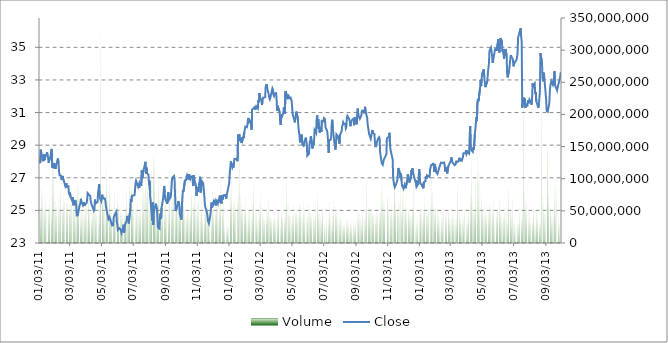
| Category | Volume |
|---|---|
| 2011-01-03 | 53450110 |
| 2011-01-04 | 54409555 |
| 2011-01-05 | 58998239 |
| 2011-01-06 | 88026271 |
| 2011-01-07 | 73761979 |
| 2011-01-10 | 57573450 |
| 2011-01-11 | 50308414 |
| 2011-01-12 | 52636699 |
| 2011-01-13 | 67082768 |
| 2011-01-14 | 62691185 |
| 2011-01-18 | 53332616 |
| 2011-01-19 | 50005830 |
| 2011-01-20 | 58621931 |
| 2011-01-21 | 58080269 |
| 2011-01-24 | 52055812 |
| 2011-01-25 | 42436532 |
| 2011-01-26 | 74628760 |
| 2011-01-27 | 146938589 |
| 2011-01-28 | 141259158 |
| 2011-01-31 | 65028938 |
| 2011-02-01 | 62810661 |
| 2011-02-02 | 45836488 |
| 2011-02-03 | 60340059 |
| 2011-02-04 | 40416627 |
| 2011-02-07 | 68980871 |
| 2011-02-08 | 34910467 |
| 2011-02-09 | 52905018 |
| 2011-02-10 | 76672349 |
| 2011-02-11 | 83939643 |
| 2011-02-14 | 56766112 |
| 2011-02-15 | 44120592 |
| 2011-02-16 | 70817867 |
| 2011-02-17 | 57211558 |
| 2011-02-18 | 68672855 |
| 2011-02-22 | 60888998 |
| 2011-02-23 | 60234083 |
| 2011-02-24 | 64499005 |
| 2011-02-25 | 53006263 |
| 2011-02-28 | 51379675 |
| 2011-03-01 | 60054986 |
| 2011-03-02 | 48658193 |
| 2011-03-03 | 68271500 |
| 2011-03-04 | 70437154 |
| 2011-03-07 | 64987131 |
| 2011-03-08 | 50555383 |
| 2011-03-09 | 39792379 |
| 2011-03-10 | 66557502 |
| 2011-03-11 | 49906849 |
| 2011-03-14 | 54456558 |
| 2011-03-15 | 76064201 |
| 2011-03-16 | 100718988 |
| 2011-03-17 | 62506557 |
| 2011-03-18 | 85486688 |
| 2011-03-21 | 46895059 |
| 2011-03-22 | 30903641 |
| 2011-03-23 | 44018832 |
| 2011-03-24 | 38696661 |
| 2011-03-25 | 57031023 |
| 2011-03-28 | 48975380 |
| 2011-03-29 | 40772423 |
| 2011-03-30 | 42000178 |
| 2011-03-31 | 63281785 |
| 2011-04-01 | 63114201 |
| 2011-04-04 | 35441052 |
| 2011-04-05 | 73693937 |
| 2011-04-06 | 65589617 |
| 2011-04-07 | 46134637 |
| 2011-04-08 | 39890629 |
| 2011-04-11 | 34286211 |
| 2011-04-12 | 36936975 |
| 2011-04-13 | 38144621 |
| 2011-04-14 | 55245529 |
| 2011-04-15 | 65080348 |
| 2011-04-18 | 58046281 |
| 2011-04-19 | 38892333 |
| 2011-04-20 | 61608587 |
| 2011-04-21 | 46892292 |
| 2011-04-25 | 33525057 |
| 2011-04-26 | 69199457 |
| 2011-04-27 | 52688981 |
| 2011-04-28 | 80158577 |
| 2011-04-29 | 319317852 |
| 2011-05-02 | 89834099 |
| 2011-05-03 | 71909361 |
| 2011-05-04 | 73292270 |
| 2011-05-05 | 55626793 |
| 2011-05-06 | 55993642 |
| 2011-05-09 | 38696376 |
| 2011-05-10 | 120806139 |
| 2011-05-11 | 78604669 |
| 2011-05-12 | 77366952 |
| 2011-05-13 | 66819290 |
| 2011-05-16 | 91402408 |
| 2011-05-17 | 82894458 |
| 2011-05-18 | 53931025 |
| 2011-05-19 | 37783590 |
| 2011-05-20 | 45451462 |
| 2011-05-23 | 52703425 |
| 2011-05-24 | 47692976 |
| 2011-05-25 | 34903112 |
| 2011-05-26 | 78016538 |
| 2011-05-27 | 50254323 |
| 2011-05-31 | 60196203 |
| 2011-06-01 | 74036467 |
| 2011-06-02 | 51487738 |
| 2011-06-03 | 60697662 |
| 2011-06-06 | 54778670 |
| 2011-06-07 | 41112524 |
| 2011-06-08 | 42206806 |
| 2011-06-09 | 42882262 |
| 2011-06-10 | 49327104 |
| 2011-06-13 | 47574074 |
| 2011-06-14 | 42902699 |
| 2011-06-15 | 49410128 |
| 2011-06-16 | 57190388 |
| 2011-06-17 | 83352877 |
| 2011-06-20 | 54344045 |
| 2011-06-21 | 49712104 |
| 2011-06-22 | 44290814 |
| 2011-06-23 | 59472060 |
| 2011-06-24 | 101387157 |
| 2011-06-27 | 92044114 |
| 2011-06-28 | 81032018 |
| 2011-06-29 | 66052078 |
| 2011-06-30 | 52536288 |
| 2011-07-01 | 52914516 |
| 2011-07-05 | 37803059 |
| 2011-07-06 | 48748894 |
| 2011-07-07 | 51950943 |
| 2011-07-08 | 58332434 |
| 2011-07-11 | 44000715 |
| 2011-07-12 | 47320989 |
| 2011-07-13 | 40869336 |
| 2011-07-14 | 46385928 |
| 2011-07-15 | 49134401 |
| 2011-07-18 | 44506711 |
| 2011-07-19 | 86730600 |
| 2011-07-20 | 49795352 |
| 2011-07-21 | 81737342 |
| 2011-07-22 | 76380505 |
| 2011-07-25 | 108486590 |
| 2011-07-26 | 74643391 |
| 2011-07-27 | 71492139 |
| 2011-07-28 | 83766901 |
| 2011-07-29 | 104394739 |
| 2011-08-01 | 61846218 |
| 2011-08-02 | 87164516 |
| 2011-08-03 | 64583238 |
| 2011-08-04 | 92953765 |
| 2011-08-05 | 112072491 |
| 2011-08-08 | 134257113 |
| 2011-08-09 | 126278864 |
| 2011-08-10 | 127819718 |
| 2011-08-11 | 90697205 |
| 2011-08-12 | 64791784 |
| 2011-08-15 | 56529388 |
| 2011-08-16 | 54256723 |
| 2011-08-17 | 50923682 |
| 2011-08-18 | 105715509 |
| 2011-08-19 | 77402319 |
| 2011-08-22 | 54720967 |
| 2011-08-23 | 59671022 |
| 2011-08-24 | 45329610 |
| 2011-08-25 | 48191924 |
| 2011-08-26 | 71959200 |
| 2011-08-29 | 38863136 |
| 2011-08-30 | 57341367 |
| 2011-08-31 | 59301724 |
| 2011-09-01 | 60511548 |
| 2011-09-02 | 43897065 |
| 2011-09-06 | 54931986 |
| 2011-09-07 | 41960917 |
| 2011-09-08 | 65818212 |
| 2011-09-09 | 64531339 |
| 2011-09-12 | 55047244 |
| 2011-09-13 | 48794446 |
| 2011-09-14 | 66742534 |
| 2011-09-15 | 67809210 |
| 2011-09-16 | 89685212 |
| 2011-09-19 | 52324841 |
| 2011-09-20 | 49211857 |
| 2011-09-21 | 72750701 |
| 2011-09-22 | 96285920 |
| 2011-09-23 | 64769019 |
| 2011-09-26 | 51057571 |
| 2011-09-27 | 55623705 |
| 2011-09-28 | 60740399 |
| 2011-09-29 | 63411976 |
| 2011-09-30 | 54086654 |
| 2011-10-03 | 64596171 |
| 2011-10-04 | 83485396 |
| 2011-10-05 | 94061244 |
| 2011-10-06 | 55113496 |
| 2011-10-07 | 52748451 |
| 2011-10-10 | 41822239 |
| 2011-10-11 | 38826791 |
| 2011-10-12 | 52493454 |
| 2011-10-13 | 43830076 |
| 2011-10-14 | 50949439 |
| 2011-10-17 | 39453241 |
| 2011-10-18 | 52491969 |
| 2011-10-19 | 42881648 |
| 2011-10-20 | 76300104 |
| 2011-10-21 | 76620533 |
| 2011-10-24 | 56897791 |
| 2011-10-25 | 53554554 |
| 2011-10-26 | 63029830 |
| 2011-10-27 | 74515622 |
| 2011-10-28 | 57712077 |
| 2011-10-31 | 46798951 |
| 2011-11-01 | 61186956 |
| 2011-11-02 | 53536398 |
| 2011-11-03 | 65837011 |
| 2011-11-04 | 36553269 |
| 2011-11-07 | 42586043 |
| 2011-11-08 | 47825636 |
| 2011-11-09 | 62950825 |
| 2011-11-10 | 32517281 |
| 2011-11-11 | 37903971 |
| 2011-11-14 | 34199146 |
| 2011-11-15 | 43877075 |
| 2011-11-16 | 53262743 |
| 2011-11-17 | 70977495 |
| 2011-11-18 | 47627157 |
| 2011-11-21 | 61882819 |
| 2011-11-22 | 49204488 |
| 2011-11-23 | 49105287 |
| 2011-11-25 | 26164410 |
| 2011-11-28 | 46771878 |
| 2011-11-29 | 40920907 |
| 2011-11-30 | 81353522 |
| 2011-12-01 | 48545338 |
| 2011-12-02 | 52295245 |
| 2011-12-05 | 56818367 |
| 2011-12-06 | 46175294 |
| 2011-12-07 | 62669835 |
| 2011-12-08 | 60522185 |
| 2011-12-09 | 53790403 |
| 2011-12-12 | 38945867 |
| 2011-12-13 | 54581003 |
| 2011-12-14 | 47927107 |
| 2011-12-15 | 46217486 |
| 2011-12-16 | 101410082 |
| 2011-12-19 | 52258284 |
| 2011-12-20 | 60767523 |
| 2011-12-21 | 64134140 |
| 2011-12-22 | 35794085 |
| 2011-12-23 | 23205776 |
| 2011-12-27 | 21287332 |
| 2011-12-28 | 29823501 |
| 2011-12-29 | 22616883 |
| 2011-12-30 | 27396333 |
| 2012-01-03 | 64735391 |
| 2012-01-04 | 80519402 |
| 2012-01-05 | 56082205 |
| 2012-01-06 | 99459469 |
| 2012-01-09 | 59708266 |
| 2012-01-10 | 60014333 |
| 2012-01-11 | 65586477 |
| 2012-01-12 | 49375477 |
| 2012-01-13 | 60204902 |
| 2012-01-17 | 72395252 |
| 2012-01-18 | 64860509 |
| 2012-01-19 | 74053427 |
| 2012-01-20 | 165902897 |
| 2012-01-23 | 76081814 |
| 2012-01-24 | 51711367 |
| 2012-01-25 | 59236267 |
| 2012-01-26 | 49107458 |
| 2012-01-27 | 44190573 |
| 2012-01-30 | 51114661 |
| 2012-01-31 | 50572372 |
| 2012-02-01 | 67413817 |
| 2012-02-02 | 52226255 |
| 2012-02-03 | 41845397 |
| 2012-02-06 | 28040378 |
| 2012-02-07 | 39242529 |
| 2012-02-08 | 49662740 |
| 2012-02-09 | 50481549 |
| 2012-02-10 | 44606751 |
| 2012-02-13 | 33322516 |
| 2012-02-14 | 59662711 |
| 2012-02-15 | 43316117 |
| 2012-02-16 | 94705078 |
| 2012-02-17 | 70040830 |
| 2012-02-21 | 50832547 |
| 2012-02-22 | 49253117 |
| 2012-02-23 | 35035609 |
| 2012-02-24 | 35577833 |
| 2012-02-27 | 34575391 |
| 2012-02-28 | 45230573 |
| 2012-02-29 | 59326545 |
| 2012-03-01 | 77348930 |
| 2012-03-02 | 47318927 |
| 2012-03-05 | 45239832 |
| 2012-03-06 | 51938950 |
| 2012-03-07 | 34340619 |
| 2012-03-08 | 36752011 |
| 2012-03-09 | 34628398 |
| 2012-03-12 | 34076755 |
| 2012-03-13 | 48951650 |
| 2012-03-14 | 41987743 |
| 2012-03-15 | 49070794 |
| 2012-03-16 | 65626398 |
| 2012-03-19 | 44797109 |
| 2012-03-20 | 41566788 |
| 2012-03-21 | 37935484 |
| 2012-03-22 | 31749516 |
| 2012-03-23 | 35912885 |
| 2012-03-26 | 36758279 |
| 2012-03-27 | 36274889 |
| 2012-03-28 | 41350041 |
| 2012-03-29 | 37038894 |
| 2012-03-30 | 31754740 |
| 2012-04-02 | 35850785 |
| 2012-04-03 | 42752025 |
| 2012-04-04 | 49455870 |
| 2012-04-05 | 50342719 |
| 2012-04-09 | 31062811 |
| 2012-04-10 | 54137247 |
| 2012-04-11 | 43016353 |
| 2012-04-12 | 38306010 |
| 2012-04-13 | 39749525 |
| 2012-04-16 | 38130098 |
| 2012-04-17 | 34361728 |
| 2012-04-18 | 40555467 |
| 2012-04-19 | 54781106 |
| 2012-04-20 | 106052027 |
| 2012-04-23 | 61403840 |
| 2012-04-24 | 40871061 |
| 2012-04-25 | 62496907 |
| 2012-04-26 | 40312879 |
| 2012-04-27 | 41423609 |
| 2012-04-30 | 35706696 |
| 2012-05-01 | 43833208 |
| 2012-05-02 | 37387978 |
| 2012-05-03 | 31504327 |
| 2012-05-04 | 57928336 |
| 2012-05-07 | 48644875 |
| 2012-05-08 | 46337430 |
| 2012-05-09 | 50309301 |
| 2012-05-10 | 43839116 |
| 2012-05-11 | 43460342 |
| 2012-05-14 | 40528885 |
| 2012-05-15 | 61830348 |
| 2012-05-16 | 60083687 |
| 2012-05-17 | 48487178 |
| 2012-05-18 | 56205262 |
| 2012-05-21 | 38794203 |
| 2012-05-22 | 39508257 |
| 2012-05-23 | 65170962 |
| 2012-05-24 | 52576022 |
| 2012-05-25 | 29508245 |
| 2012-05-29 | 37758958 |
| 2012-05-30 | 41590049 |
| 2012-05-31 | 39142318 |
| 2012-06-01 | 56641282 |
| 2012-06-04 | 47928161 |
| 2012-06-05 | 45715327 |
| 2012-06-06 | 46860486 |
| 2012-06-07 | 37794901 |
| 2012-06-08 | 42554321 |
| 2012-06-11 | 46365066 |
| 2012-06-12 | 35338135 |
| 2012-06-13 | 32984515 |
| 2012-06-14 | 39460156 |
| 2012-06-15 | 62314362 |
| 2012-06-18 | 58679618 |
| 2012-06-19 | 75725717 |
| 2012-06-20 | 36257101 |
| 2012-06-21 | 48461283 |
| 2012-06-22 | 45098017 |
| 2012-06-25 | 42225199 |
| 2012-06-26 | 38422237 |
| 2012-06-27 | 33783977 |
| 2012-06-28 | 45333920 |
| 2012-06-29 | 55227108 |
| 2012-07-02 | 30589039 |
| 2012-07-03 | 20941442 |
| 2012-07-05 | 28802821 |
| 2012-07-06 | 38297403 |
| 2012-07-09 | 30682552 |
| 2012-07-10 | 37537369 |
| 2012-07-11 | 39188842 |
| 2012-07-12 | 63530444 |
| 2012-07-13 | 39090585 |
| 2012-07-16 | 27901963 |
| 2012-07-17 | 33776331 |
| 2012-07-18 | 41100151 |
| 2012-07-19 | 46663183 |
| 2012-07-20 | 64027078 |
| 2012-07-23 | 55151880 |
| 2012-07-24 | 47723277 |
| 2012-07-25 | 45583794 |
| 2012-07-26 | 45302964 |
| 2012-07-27 | 44244766 |
| 2012-07-30 | 28904869 |
| 2012-07-31 | 37622808 |
| 2012-08-01 | 31722523 |
| 2012-08-02 | 39523066 |
| 2012-08-03 | 35860411 |
| 2012-08-06 | 27473823 |
| 2012-08-07 | 28003409 |
| 2012-08-08 | 26258427 |
| 2012-08-09 | 24920732 |
| 2012-08-10 | 27813460 |
| 2012-08-13 | 23053520 |
| 2012-08-14 | 34552536 |
| 2012-08-15 | 24351641 |
| 2012-08-16 | 35788904 |
| 2012-08-17 | 32597464 |
| 2012-08-20 | 23739124 |
| 2012-08-21 | 28823883 |
| 2012-08-22 | 33438369 |
| 2012-08-23 | 28356539 |
| 2012-08-24 | 22951098 |
| 2012-08-27 | 34692509 |
| 2012-08-28 | 23948613 |
| 2012-08-29 | 23347975 |
| 2012-08-30 | 23982028 |
| 2012-08-31 | 36595417 |
| 2012-09-04 | 48561825 |
| 2012-09-05 | 33650751 |
| 2012-09-06 | 48371613 |
| 2012-09-07 | 42652923 |
| 2012-09-10 | 40524855 |
| 2012-09-11 | 25194218 |
| 2012-09-12 | 32779041 |
| 2012-09-13 | 45052177 |
| 2012-09-14 | 51422730 |
| 2012-09-17 | 36488844 |
| 2012-09-18 | 34542689 |
| 2012-09-19 | 48881762 |
| 2012-09-20 | 45549355 |
| 2012-09-21 | 102348791 |
| 2012-09-24 | 46825826 |
| 2012-09-25 | 54275689 |
| 2012-09-26 | 54679301 |
| 2012-09-27 | 47130850 |
| 2012-09-28 | 54232061 |
| 2012-10-01 | 54042532 |
| 2012-10-02 | 43338811 |
| 2012-10-03 | 46663995 |
| 2012-10-04 | 43640874 |
| 2012-10-05 | 41135532 |
| 2012-10-08 | 29755574 |
| 2012-10-09 | 45130560 |
| 2012-10-10 | 47227080 |
| 2012-10-11 | 41490756 |
| 2012-10-12 | 46466731 |
| 2012-10-15 | 42448472 |
| 2012-10-16 | 47745539 |
| 2012-10-17 | 44211740 |
| 2012-10-18 | 59238423 |
| 2012-10-19 | 90476951 |
| 2012-10-22 | 83383976 |
| 2012-10-23 | 64418754 |
| 2012-10-24 | 53329233 |
| 2012-10-25 | 54083785 |
| 2012-10-26 | 57789995 |
| 2012-10-31 | 69467692 |
| 2012-11-01 | 72047818 |
| 2012-11-02 | 57139342 |
| 2012-11-05 | 38071723 |
| 2012-11-06 | 43408274 |
| 2012-11-07 | 57876864 |
| 2012-11-08 | 49841738 |
| 2012-11-09 | 43295893 |
| 2012-11-12 | 61112106 |
| 2012-11-13 | 131688992 |
| 2012-11-14 | 76095405 |
| 2012-11-15 | 50955598 |
| 2012-11-16 | 64088293 |
| 2012-11-19 | 57179237 |
| 2012-11-20 | 47070367 |
| 2012-11-21 | 66360250 |
| 2012-11-23 | 57845672 |
| 2012-11-26 | 85198661 |
| 2012-11-27 | 45023854 |
| 2012-11-28 | 53018349 |
| 2012-11-29 | 69558839 |
| 2012-11-30 | 83690187 |
| 2012-12-03 | 53173722 |
| 2012-12-04 | 49798319 |
| 2012-12-05 | 68283731 |
| 2012-12-06 | 39186491 |
| 2012-12-07 | 46179491 |
| 2012-12-10 | 47037881 |
| 2012-12-11 | 52288386 |
| 2012-12-12 | 43966242 |
| 2012-12-13 | 45080041 |
| 2012-12-14 | 42077469 |
| 2012-12-17 | 42053240 |
| 2012-12-18 | 50494942 |
| 2012-12-19 | 53523188 |
| 2012-12-20 | 52607251 |
| 2012-12-21 | 98779723 |
| 2012-12-24 | 20842331 |
| 2012-12-26 | 31640952 |
| 2012-12-27 | 39393927 |
| 2012-12-28 | 28248325 |
| 2012-12-31 | 42757836 |
| 2013-01-02 | 52905499 |
| 2013-01-03 | 48297740 |
| 2013-01-04 | 52521019 |
| 2013-01-07 | 37120059 |
| 2013-01-08 | 44703081 |
| 2013-01-09 | 49047873 |
| 2013-01-10 | 71430810 |
| 2013-01-11 | 55518050 |
| 2013-01-14 | 48324338 |
| 2013-01-15 | 48244452 |
| 2013-01-16 | 41077374 |
| 2013-01-17 | 51685841 |
| 2013-01-18 | 52171305 |
| 2013-01-22 | 58656745 |
| 2013-01-23 | 50387614 |
| 2013-01-24 | 101739246 |
| 2013-01-25 | 81853106 |
| 2013-01-28 | 56061493 |
| 2013-01-29 | 49247863 |
| 2013-01-30 | 43585526 |
| 2013-01-31 | 50536148 |
| 2013-02-01 | 55566440 |
| 2013-02-04 | 50539942 |
| 2013-02-05 | 35410361 |
| 2013-02-06 | 41889572 |
| 2013-02-07 | 38034068 |
| 2013-02-08 | 33320436 |
| 2013-02-11 | 32248149 |
| 2013-02-12 | 35991329 |
| 2013-02-13 | 41716060 |
| 2013-02-14 | 32663454 |
| 2013-02-15 | 49657740 |
| 2013-02-19 | 38806870 |
| 2013-02-20 | 44112446 |
| 2013-02-21 | 49085538 |
| 2013-02-22 | 31430018 |
| 2013-02-25 | 48020353 |
| 2013-02-26 | 49925050 |
| 2013-02-27 | 36395589 |
| 2013-02-28 | 35840861 |
| 2013-03-01 | 34851878 |
| 2013-03-04 | 38167497 |
| 2013-03-05 | 41437141 |
| 2013-03-06 | 51448913 |
| 2013-03-07 | 29197630 |
| 2013-03-08 | 37671493 |
| 2013-03-11 | 36635432 |
| 2013-03-12 | 39259456 |
| 2013-03-13 | 29103208 |
| 2013-03-14 | 55917303 |
| 2013-03-15 | 92711915 |
| 2013-03-18 | 44828022 |
| 2013-03-19 | 51902968 |
| 2013-03-20 | 35454207 |
| 2013-03-21 | 34234566 |
| 2013-03-22 | 28720834 |
| 2013-03-25 | 44153931 |
| 2013-03-26 | 27831654 |
| 2013-03-27 | 36048959 |
| 2013-03-28 | 55455613 |
| 2013-04-01 | 29203122 |
| 2013-04-02 | 28460384 |
| 2013-04-03 | 35064468 |
| 2013-04-04 | 45267601 |
| 2013-04-05 | 50928776 |
| 2013-04-08 | 34759724 |
| 2013-04-09 | 77737851 |
| 2013-04-10 | 71116616 |
| 2013-04-11 | 130923162 |
| 2013-04-12 | 62888012 |
| 2013-04-15 | 56335548 |
| 2013-04-16 | 52804656 |
| 2013-04-17 | 52841328 |
| 2013-04-18 | 56906528 |
| 2013-04-19 | 99793502 |
| 2013-04-22 | 137909468 |
| 2013-04-23 | 59126880 |
| 2013-04-24 | 90955499 |
| 2013-04-25 | 110700124 |
| 2013-04-26 | 47802884 |
| 2013-04-29 | 59122266 |
| 2013-04-30 | 75166967 |
| 2013-05-01 | 54336834 |
| 2013-05-02 | 46069472 |
| 2013-05-03 | 46786840 |
| 2013-05-06 | 40982478 |
| 2013-05-07 | 43078268 |
| 2013-05-08 | 51595643 |
| 2013-05-09 | 46417802 |
| 2013-05-10 | 36396524 |
| 2013-05-13 | 36036347 |
| 2013-05-14 | 56874005 |
| 2013-05-15 | 46309506 |
| 2013-05-16 | 59384283 |
| 2013-05-17 | 60674267 |
| 2013-05-20 | 54025227 |
| 2013-05-21 | 48705362 |
| 2013-05-22 | 65892481 |
| 2013-05-23 | 51113510 |
| 2013-05-24 | 33175804 |
| 2013-05-28 | 48218180 |
| 2013-05-29 | 38419848 |
| 2013-05-30 | 51133616 |
| 2013-05-31 | 56167723 |
| 2013-06-03 | 51256272 |
| 2013-06-04 | 65538438 |
| 2013-06-05 | 46032657 |
| 2013-06-06 | 37627133 |
| 2013-06-07 | 40762249 |
| 2013-06-10 | 35995223 |
| 2013-06-11 | 39350316 |
| 2013-06-12 | 37373032 |
| 2013-06-13 | 45654803 |
| 2013-06-14 | 53116371 |
| 2013-06-17 | 49672492 |
| 2013-06-18 | 28622929 |
| 2013-06-19 | 30820208 |
| 2013-06-20 | 54496758 |
| 2013-06-21 | 85338395 |
| 2013-06-24 | 56113708 |
| 2013-06-25 | 44073348 |
| 2013-06-26 | 48667834 |
| 2013-06-27 | 28993542 |
| 2013-06-28 | 65548196 |
| 2013-07-01 | 31064000 |
| 2013-07-02 | 37634572 |
| 2013-07-03 | 15994380 |
| 2013-07-05 | 26085981 |
| 2013-07-08 | 32398742 |
| 2013-07-09 | 25320908 |
| 2013-07-10 | 29658734 |
| 2013-07-11 | 53638234 |
| 2013-07-12 | 35502638 |
| 2013-07-15 | 34145645 |
| 2013-07-16 | 36378681 |
| 2013-07-17 | 37289320 |
| 2013-07-18 | 49547075 |
| 2013-07-19 | 248428494 |
| 2013-07-22 | 79040666 |
| 2013-07-23 | 65819208 |
| 2013-07-24 | 52812049 |
| 2013-07-25 | 63221356 |
| 2013-07-26 | 38637339 |
| 2013-07-29 | 28874879 |
| 2013-07-30 | 45801156 |
| 2013-07-31 | 43900515 |
| 2013-08-01 | 42557872 |
| 2013-08-02 | 29199813 |
| 2013-08-05 | 30986512 |
| 2013-08-06 | 36334889 |
| 2013-08-07 | 38078570 |
| 2013-08-08 | 59038538 |
| 2013-08-09 | 26803879 |
| 2013-08-12 | 25501910 |
| 2013-08-13 | 39473018 |
| 2013-08-14 | 48528230 |
| 2013-08-15 | 33340728 |
| 2013-08-16 | 32866242 |
| 2013-08-19 | 27908716 |
| 2013-08-20 | 22979513 |
| 2013-08-21 | 37409095 |
| 2013-08-22 | 31169898 |
| 2013-08-23 | 225493737 |
| 2013-08-26 | 72786745 |
| 2013-08-27 | 58522264 |
| 2013-08-28 | 44262716 |
| 2013-08-29 | 45284632 |
| 2013-08-30 | 42784642 |
| 2013-09-03 | 154506984 |
| 2013-09-04 | 142320588 |
| 2013-09-05 | 71644891 |
| 2013-09-06 | 75439554 |
| 2013-09-09 | 49628450 |
| 2013-09-10 | 56887967 |
| 2013-09-11 | 39087430 |
| 2013-09-12 | 32867691 |
| 2013-09-13 | 40905938 |
| 2013-09-16 | 55017879 |
| 2013-09-17 | 84716461 |
| 2013-09-18 | 64103344 |
| 2013-09-19 | 42026553 |
| 2013-09-20 | 102904859 |
| 2013-09-24 | 40684948 |
| 2013-09-25 | 28907426 |
| 2013-09-26 | 28503917 |
| 2013-09-30 | 39839541 |
| 2013-10-01 | 36718733 |